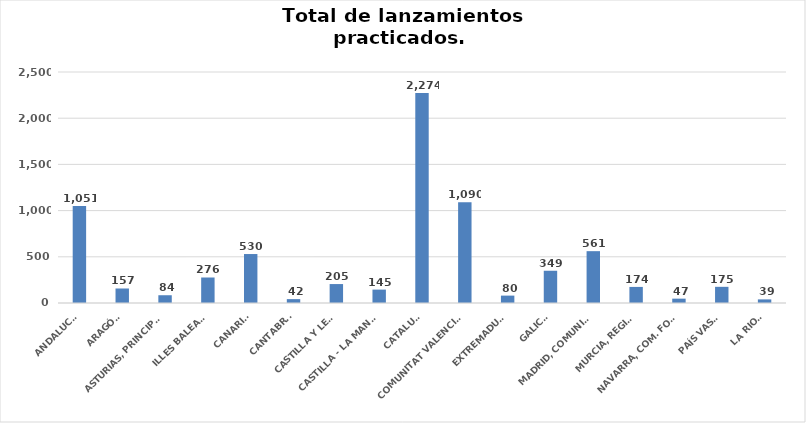
| Category | Series 0 |
|---|---|
| ANDALUCÍA | 1051 |
| ARAGÓN | 157 |
| ASTURIAS, PRINCIPADO | 84 |
| ILLES BALEARS | 276 |
| CANARIAS | 530 |
| CANTABRIA | 42 |
| CASTILLA Y LEÓN | 205 |
| CASTILLA - LA MANCHA | 145 |
| CATALUÑA | 2274 |
| COMUNITAT VALENCIANA | 1090 |
| EXTREMADURA | 80 |
| GALICIA | 349 |
| MADRID, COMUNIDAD | 561 |
| MURCIA, REGIÓN | 174 |
| NAVARRA, COM. FORAL | 47 |
| PAÍS VASCO | 175 |
| LA RIOJA | 39 |